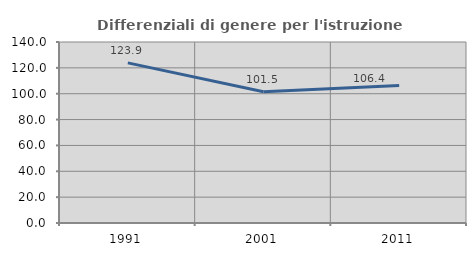
| Category | Differenziali di genere per l'istruzione superiore |
|---|---|
| 1991.0 | 123.862 |
| 2001.0 | 101.528 |
| 2011.0 | 106.379 |